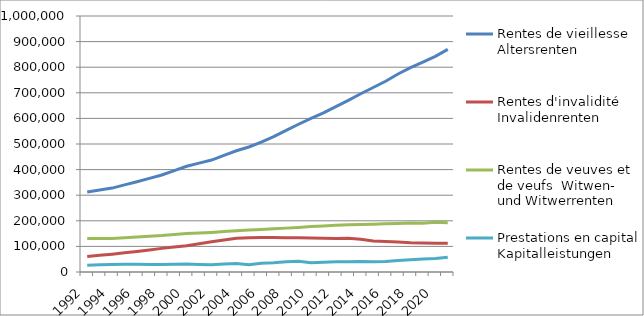
| Category | Rentes de vieillesse | Rentes d'invalidité | Rentes de veuves et de veufs | Prestations en capital |
|---|---|---|---|---|
| 1992.0 | 312325 | 60597 | 130710 | 26457 |
| 1993.0 | 320058.5 | 65179 | 130871 | 28070.5 |
| 1994.0 | 327792 | 69761 | 131032 | 29684 |
| 1995.0 | 340185.5 | 74892 | 133756 | 30013 |
| 1996.0 | 352579 | 80023 | 136480 | 30342 |
| 1997.0 | 365830 | 86134.5 | 139322 | 29743.5 |
| 1998.0 | 379081 | 92246 | 142164 | 29145 |
| 1999.0 | 396080.5 | 97375 | 146104 | 30154.5 |
| 2000.0 | 413080 | 102504 | 150044 | 31164 |
| 2001.0 | 425192 | 110169.5 | 152324 | 29736 |
| 2002.0 | 437304 | 117835 | 154604 | 28308 |
| 2003.0 | 455437 | 124769.5 | 157800.5 | 30957 |
| 2004.0 | 473570 | 131704 | 160997 | 33606 |
| 2005.0 | 488218 | 133371 | 163634 | 28143 |
| 2006.0 | 507256 | 134804 | 166104 | 33892 |
| 2007.0 | 528866 | 134620 | 168510 | 36394 |
| 2008.0 | 553378 | 134217 | 171383 | 40285 |
| 2009.0 | 577165 | 133895 | 174016 | 42156 |
| 2010.0 | 599856 | 133163 | 177311 | 36225 |
| 2011.0 | 621780 | 132139 | 179991 | 37918 |
| 2012.0 | 645702 | 131150 | 182339 | 40382 |
| 2013.0 | 670411 | 131708 | 184499 | 39664 |
| 2014.0 | 696176 | 128265 | 185096 | 41369 |
| 2015.0 | 720815 | 120706 | 186484 | 39719 |
| 2016.0 | 744977 | 119500 | 188012 | 41187 |
| 2017.0 | 773299 | 117286 | 189571 | 44476 |
| 2018.0 | 798554 | 114534 | 191046 | 48142 |
| 2019.0 | 819887 | 113029 | 190604 | 51028 |
| 2020.0 | 842357 | 111975 | 194113 | 52405 |
| 2021.0 | 869722 | 111883 | 192806 | 57543 |